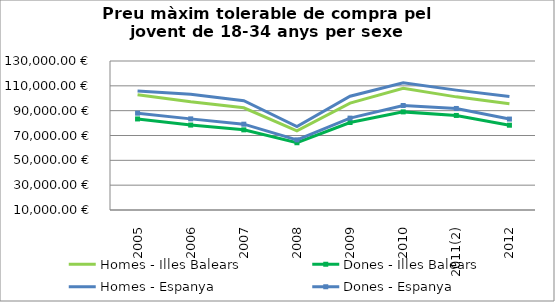
| Category | Homes - Illes Balears | Dones - Illes Balears | Homes - Espanya | Dones - Espanya |
|---|---|---|---|---|
| 2005 | 102850.69 | 83329.42 | 105844.92 | 87978.83 |
| 2006 | 97104.15 | 78405.7 | 103279.3 | 83391.76 |
| 2007 | 92327.92 | 74549.19 | 97987.76 | 79119.17 |
| 2008 | 73757.41 | 64170.71 | 77221.6 | 66488.18 |
| 2009 | 96099.35 | 80475.79 | 101627.99 | 84003.68 |
| 2010 | 107990.42 | 89022.06 | 112526.64 | 94169.48 |
| 2011(2) | 101120.117 | 86144.293 | 106542.297 | 91774.96 |
| 2012 | 95581.69 | 78283.06 | 101374.1 | 83234.14 |